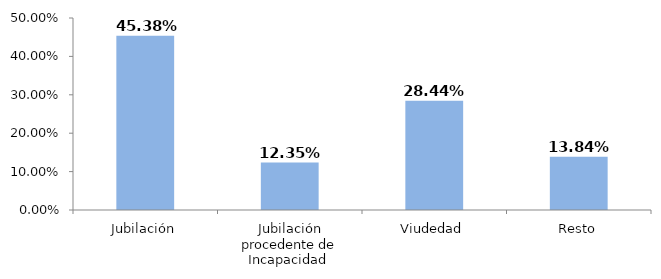
| Category | Series 0 |
|---|---|
| Jubilación | 0.454 |
| Jubilación procedente de Incapacidad  | 0.124 |
| Viudedad | 0.284 |
| Resto | 0.138 |